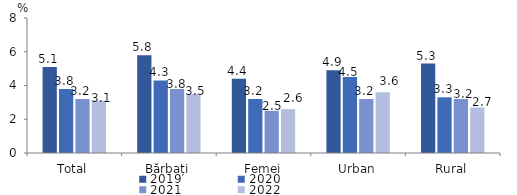
| Category | 2019 | 2020 | 2021 | 2022 |
|---|---|---|---|---|
| Total | 5.1 | 3.8 | 3.2 | 3.1 |
| Bărbați | 5.8 | 4.3 | 3.8 | 3.5 |
| Femei | 4.4 | 3.2 | 2.5 | 2.6 |
| Urban | 4.9 | 4.5 | 3.2 | 3.6 |
| Rural | 5.3 | 3.3 | 3.2 | 2.7 |